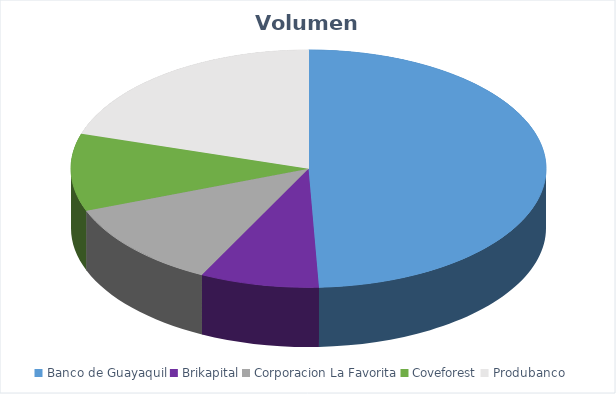
| Category | VOLUMEN ($USD) |
|---|---|
| Banco de Guayaquil | 12169.87 |
| Brikapital | 2000 |
| Corporacion La Favorita | 2915.56 |
| Coveforest | 2600 |
| Produbanco | 5000 |